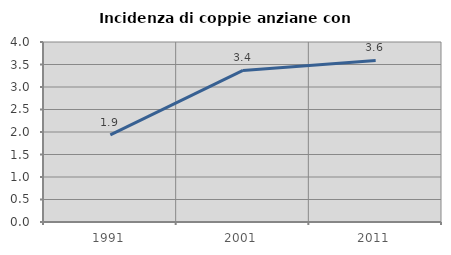
| Category | Incidenza di coppie anziane con figli |
|---|---|
| 1991.0 | 1.934 |
| 2001.0 | 3.369 |
| 2011.0 | 3.591 |